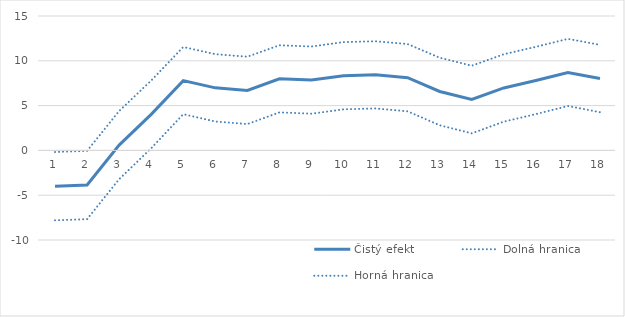
| Category | Čistý efekt | Dolná hranica | Horná hranica |
|---|---|---|---|
| 1.0 | -3.99 | -7.801 | -0.18 |
| 2.0 | -3.864 | -7.676 | -0.052 |
| 3.0 | 0.591 | -3.212 | 4.394 |
| 4.0 | 4.017 | 0.237 | 7.797 |
| 5.0 | 7.788 | 4.039 | 11.537 |
| 6.0 | 6.981 | 3.225 | 10.738 |
| 7.0 | 6.698 | 2.94 | 10.457 |
| 8.0 | 7.989 | 4.243 | 11.734 |
| 9.0 | 7.845 | 4.096 | 11.594 |
| 10.0 | 8.337 | 4.584 | 12.089 |
| 11.0 | 8.43 | 4.683 | 12.178 |
| 12.0 | 8.116 | 4.36 | 11.871 |
| 13.0 | 6.574 | 2.805 | 10.343 |
| 14.0 | 5.677 | 1.902 | 9.453 |
| 15.0 | 6.969 | 3.208 | 10.731 |
| 16.0 | 7.804 | 4.048 | 11.56 |
| 17.0 | 8.701 | 4.955 | 12.446 |
| 18.0 | 8.022 | 4.263 | 11.78 |